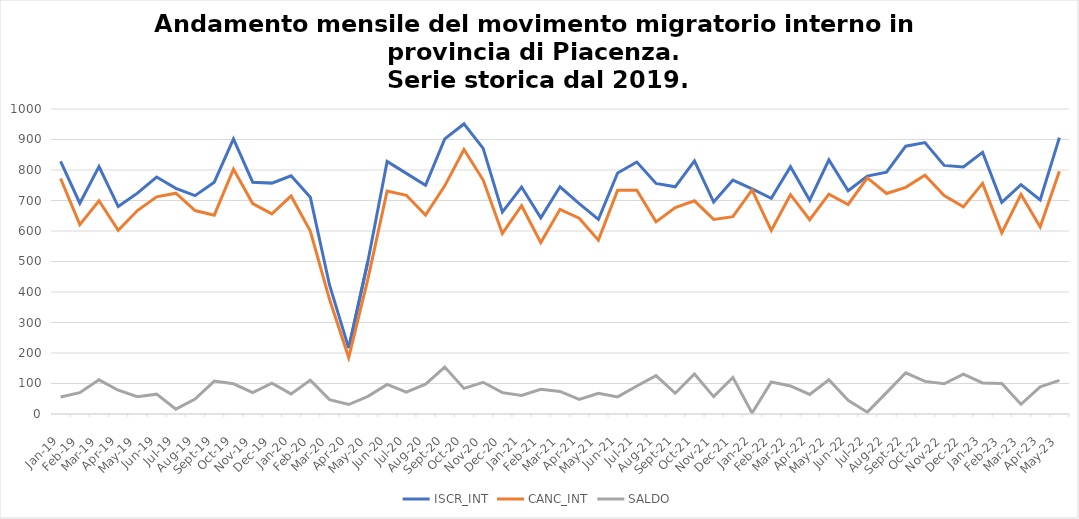
| Category | ISCR_INT | CANC_INT | SALDO |
|---|---|---|---|
| 2019-01-01 | 828 | 772 | 56 |
| 2019-02-01 | 691 | 621 | 70 |
| 2019-03-01 | 811 | 699 | 112 |
| 2019-04-01 | 680 | 602 | 78 |
| 2019-05-01 | 724 | 667 | 57 |
| 2019-06-01 | 777 | 712 | 65 |
| 2019-07-01 | 740 | 724 | 16 |
| 2019-08-01 | 716 | 667 | 49 |
| 2019-09-01 | 760 | 652 | 108 |
| 2019-10-01 | 902 | 803 | 99 |
| 2019-11-01 | 760 | 690 | 70 |
| 2019-12-01 | 757 | 656 | 101 |
| 2020-01-01 | 781 | 715 | 66 |
| 2020-02-01 | 711 | 600 | 111 |
| 2020-03-01 | 423 | 376 | 47 |
| 2020-04-01 | 216 | 185 | 31 |
| 2020-05-01 | 501 | 443 | 58 |
| 2020-06-01 | 828 | 731 | 97 |
| 2020-07-01 | 789 | 717 | 72 |
| 2020-08-01 | 750 | 652 | 98 |
| 2020-09-01 | 902 | 748 | 154 |
| 2020-10-01 | 951 | 867 | 84 |
| 2020-11-01 | 871 | 767 | 104 |
| 2020-12-01 | 662 | 592 | 70 |
| 2021-01-01 | 744 | 683 | 61 |
| 2021-02-01 | 643 | 562 | 81 |
| 2021-03-01 | 745 | 671 | 74 |
| 2021-04-01 | 690 | 642 | 48 |
| 2021-05-01 | 638 | 570 | 68 |
| 2021-06-01 | 790 | 734 | 56 |
| 2021-07-01 | 826 | 734 | 92 |
| 2021-08-01 | 756 | 630 | 126 |
| 2021-09-01 | 745 | 677 | 68 |
| 2021-10-01 | 830 | 699 | 131 |
| 2021-11-01 | 695 | 638 | 57 |
| 2021-12-01 | 767 | 647 | 120 |
| 2022-01-01 | 738 | 735 | 3 |
| 2022-02-01 | 707 | 602 | 105 |
| 2022-03-01 | 811 | 719 | 92 |
| 2022-04-01 | 701 | 637 | 64 |
| 2022-05-01 | 833 | 721 | 112 |
| 2022-06-01 | 732 | 687 | 45 |
| 2022-07-01 | 780 | 774 | 6 |
| 2022-08-01 | 793 | 723 | 70 |
| 2022-09-01 | 878 | 743 | 135 |
| 2022-10-01 | 890 | 783 | 107 |
| 2022-11-01 | 815 | 716 | 99 |
| 2022-12-01 | 810 | 679 | 131 |
| 2023-01-01 | 858 | 756 | 102 |
| 2023-02-01 | 694 | 594 | 100 |
| 2023-03-01 | 752 | 720 | 32 |
| 2023-04-01 | 702 | 613 | 89 |
| 2023-05-01 | 906 | 796 | 110 |